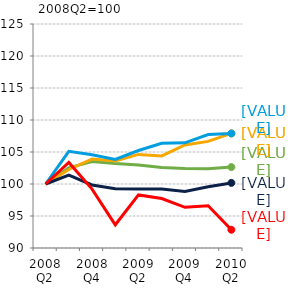
| Category | Északi országok | Mediterrán országok | KKE-régió | Magországok | Magyarország |
|---|---|---|---|---|---|
| 2008 Q2 | 100 | 100 | 100 | 100 | 100 |
| 2008 Q3 | 102.513 | 102.273 | 105.107 | 101.406 | 103.37 |
| 2008 Q4 | 103.51 | 103.901 | 104.585 | 99.85 | 99.209 |
| 2009 Q1 | 103.189 | 103.611 | 103.832 | 99.262 | 93.626 |
| 2009 Q2 | 102.962 | 104.626 | 105.229 | 99.214 | 98.289 |
| 2009 Q3 | 102.578 | 104.382 | 106.365 | 99.23 | 97.723 |
| 2009 Q4 | 102.411 | 106.1 | 106.435 | 98.824 | 96.356 |
| 2010 Q1 | 102.39 | 106.654 | 107.721 | 99.562 | 96.59 |
| 2010 Q2 | 102.644 | 107.905 | 107.901 | 100.171 | 92.854 |